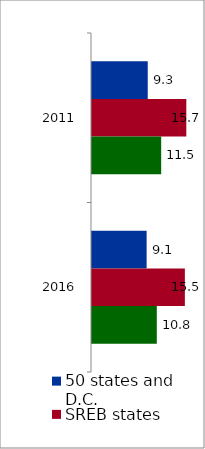
| Category | 50 states and D.C. | SREB states | State |
|---|---|---|---|
| 2011.0 | 9.289 | 15.719 | 11.53 |
| 2016.0 | 9.103 | 15.478 | 10.799 |